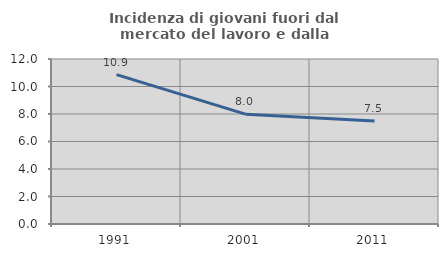
| Category | Incidenza di giovani fuori dal mercato del lavoro e dalla formazione  |
|---|---|
| 1991.0 | 10.862 |
| 2001.0 | 7.988 |
| 2011.0 | 7.496 |